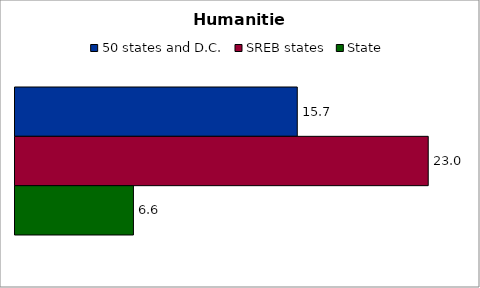
| Category | 50 states and D.C. | SREB states | State |
|---|---|---|---|
| Humanities | 15.682 | 22.957 | 6.579 |